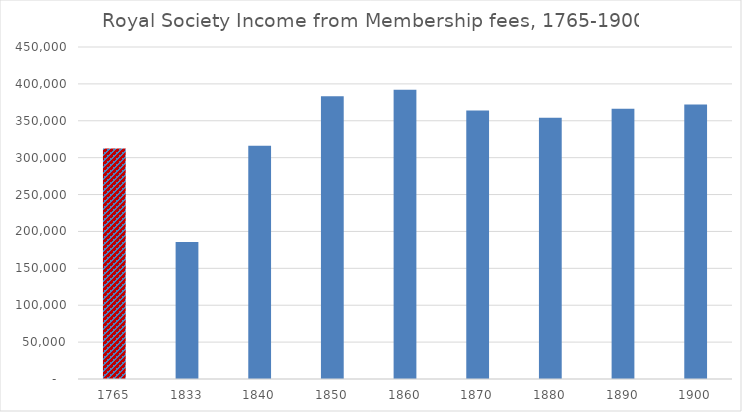
| Category | Fees |
|---|---|
| 1765.0 | 312401 |
| 1833.0 | 185610 |
| 1840.0 | 316128 |
| 1850.0 | 383088 |
| 1860.0 | 392208 |
| 1870.0 | 363888 |
| 1880.0 | 354000 |
| 1890.0 | 366240 |
| 1900.0 | 372000 |